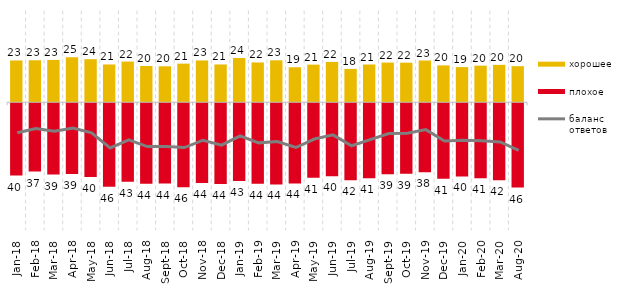
| Category | хорошее | плохое |
|---|---|---|
| 2018-01-01 | 22.9 | -39.6 |
| 2018-02-01 | 23 | -37.45 |
| 2018-03-01 | 23.2 | -39.1 |
| 2018-04-01 | 24.65 | -38.8 |
| 2018-05-01 | 23.6 | -40.4 |
| 2018-06-01 | 20.7 | -45.75 |
| 2018-07-01 | 22.3 | -42.95 |
| 2018-08-01 | 19.85 | -44.15 |
| 2018-09-01 | 19.7 | -44 |
| 2018-10-01 | 21.15 | -46 |
| 2018-11-01 | 22.904 | -43.713 |
| 2018-12-01 | 20.7 | -44.2 |
| 2019-01-01 | 24.25 | -42.65 |
| 2019-02-01 | 21.8 | -44.05 |
| 2019-03-01 | 22.974 | -44.455 |
| 2019-04-01 | 19.158 | -43.96 |
| 2019-05-01 | 20.604 | -40.763 |
| 2019-06-01 | 22.095 | -39.95 |
| 2019-07-01 | 18.267 | -42.129 |
| 2019-08-01 | 20.679 | -41.159 |
| 2019-09-01 | 21.733 | -38.911 |
| 2019-10-01 | 21.683 | -38.614 |
| 2019-11-01 | 22.871 | -37.871 |
| 2019-12-01 | 20.198 | -41.386 |
| 2020-01-01 | 19.257 | -40.099 |
| 2020-02-01 | 20.05 | -41.089 |
| 2020-03-01 | 20.476 | -42.191 |
| 2020-08-01 | 19.762 | -46.177 |